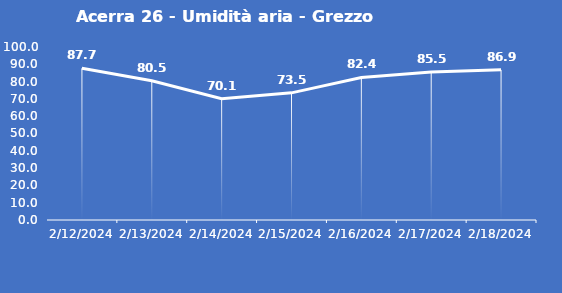
| Category | Acerra 26 - Umidità aria - Grezzo (%) |
|---|---|
| 2/12/24 | 87.7 |
| 2/13/24 | 80.5 |
| 2/14/24 | 70.1 |
| 2/15/24 | 73.5 |
| 2/16/24 | 82.4 |
| 2/17/24 | 85.5 |
| 2/18/24 | 86.9 |